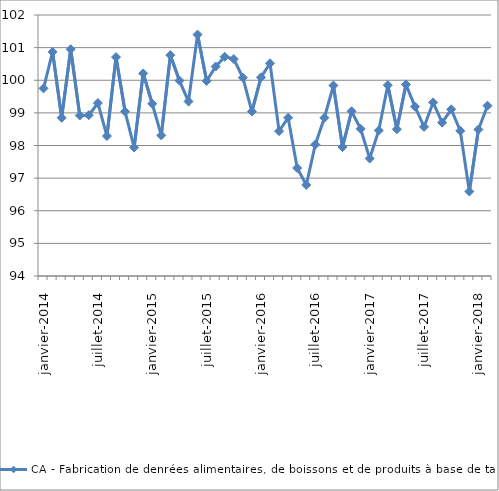
| Category | CA - Fabrication de denrées alimentaires, de boissons et de produits à base de tabac  |
|---|---|
|  janvier-2014 | 99.75 |
|  février-2014 | 100.87 |
|  mars-2014 | 98.85 |
|  avril-2014 | 100.95 |
|  mai-2014 | 98.92 |
|  juin-2014 | 98.93 |
|  juillet-2014 | 99.3 |
|  août-2014 | 98.29 |
|  septembre-2014 | 100.71 |
|  octobre-2014 | 99.04 |
|  novembre-2014 | 97.94 |
|  décembre-2014 | 100.21 |
|  janvier-2015 | 99.28 |
|  février-2015 | 98.31 |
|  mars-2015 | 100.77 |
|  avril-2015 | 99.99 |
|  mai-2015 | 99.35 |
|  juin-2015 | 101.4 |
|  juillet-2015 | 99.98 |
|  août-2015 | 100.42 |
|  septembre-2015 | 100.72 |
|  octobre-2015 | 100.65 |
|  novembre-2015 | 100.08 |
|  décembre-2015 | 99.04 |
|  janvier-2016 | 100.09 |
|  février-2016 | 100.52 |
|  mars-2016 | 98.44 |
|  avril-2016 | 98.85 |
|  mai-2016 | 97.31 |
|  juin-2016 | 96.79 |
|  juillet-2016 | 98.03 |
|  août-2016 | 98.85 |
|  septembre-2016 | 99.84 |
|  octobre-2016 | 97.95 |
|  novembre-2016 | 99.05 |
|  décembre-2016 | 98.51 |
|  janvier-2017 | 97.6 |
|  février-2017 | 98.46 |
|  mars-2017 | 99.85 |
|  avril-2017 | 98.5 |
|  mai-2017 | 99.87 |
|  juin-2017 | 99.19 |
|  juillet-2017 | 98.57 |
|  août-2017 | 99.32 |
|  septembre-2017 | 98.7 |
|  octobre-2017 | 99.11 |
|  novembre-2017 | 98.45 |
|  décembre-2017 | 96.59 |
|  janvier-2018 | 98.49 |
|  février-2018 | 99.22 |